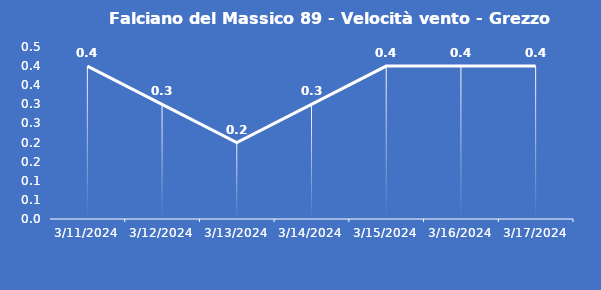
| Category | Falciano del Massico 89 - Velocità vento - Grezzo (m/s) |
|---|---|
| 3/11/24 | 0.4 |
| 3/12/24 | 0.3 |
| 3/13/24 | 0.2 |
| 3/14/24 | 0.3 |
| 3/15/24 | 0.4 |
| 3/16/24 | 0.4 |
| 3/17/24 | 0.4 |